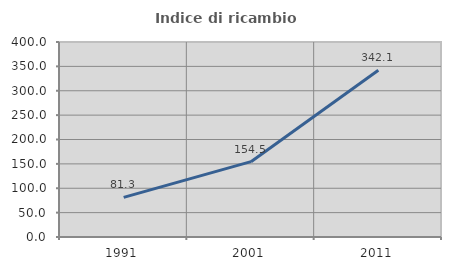
| Category | Indice di ricambio occupazionale  |
|---|---|
| 1991.0 | 81.308 |
| 2001.0 | 154.545 |
| 2011.0 | 342.105 |